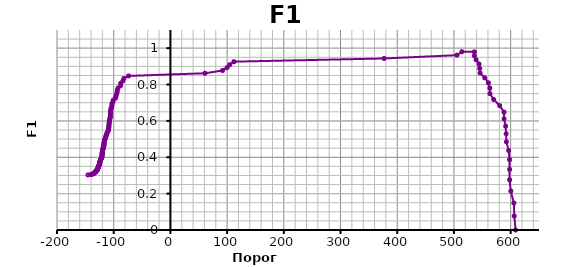
| Category | Series 0 |
|---|---|
| 608.8 | 0 |
| 606.4 | 0.077 |
| 605.6 | 0.148 |
| 600.2 | 0.214 |
| 598.1 | 0.276 |
| 598.1 | 0.333 |
| 598.1 | 0.387 |
| 596.4 | 0.438 |
| 592.5 | 0.485 |
| 592.0 | 0.529 |
| 591.1 | 0.571 |
| 588.5 | 0.611 |
| 588.3 | 0.649 |
| 580.7 | 0.684 |
| 570.1 | 0.718 |
| 563.5 | 0.75 |
| 563.2 | 0.78 |
| 560.9 | 0.81 |
| 554.4 | 0.837 |
| 546.1 | 0.864 |
| 545.4 | 0.889 |
| 544.3 | 0.913 |
| 539.0 | 0.936 |
| 536.2 | 0.958 |
| 536.2 | 0.98 |
| 514.0 | 0.98 |
| 505.4 | 0.962 |
| 376.6 | 0.943 |
| 112.1 | 0.926 |
| 104.6 | 0.909 |
| 99.9 | 0.893 |
| 91.8 | 0.877 |
| 61.1 | 0.862 |
| -73.6 | 0.847 |
| -82.1 | 0.833 |
| -83.8 | 0.82 |
| -87.8 | 0.806 |
| -87.8 | 0.794 |
| -92.3 | 0.781 |
| -93.7 | 0.769 |
| -94.0 | 0.758 |
| -95.1 | 0.746 |
| -96.0 | 0.735 |
| -97.0 | 0.725 |
| -100.7 | 0.714 |
| -101.4 | 0.704 |
| -103.0 | 0.694 |
| -103.1 | 0.685 |
| -103.6 | 0.676 |
| -104.9 | 0.667 |
| -105.3 | 0.658 |
| -105.5 | 0.649 |
| -105.5 | 0.641 |
| -105.9 | 0.633 |
| -106.1 | 0.625 |
| -106.1 | 0.617 |
| -107.2 | 0.61 |
| -107.3 | 0.602 |
| -107.8 | 0.595 |
| -107.8 | 0.588 |
| -108.3 | 0.581 |
| -108.4 | 0.575 |
| -108.6 | 0.568 |
| -108.7 | 0.562 |
| -109.2 | 0.556 |
| -109.2 | 0.549 |
| -110.0 | 0.543 |
| -111.3 | 0.538 |
| -111.7 | 0.532 |
| -112.6 | 0.526 |
| -113.1 | 0.521 |
| -113.6 | 0.515 |
| -114.3 | 0.51 |
| -114.4 | 0.505 |
| -115.4 | 0.5 |
| -116.3 | 0.495 |
| -116.3 | 0.49 |
| -116.8 | 0.485 |
| -116.9 | 0.481 |
| -117.1 | 0.476 |
| -117.1 | 0.472 |
| -117.4 | 0.467 |
| -117.5 | 0.463 |
| -117.7 | 0.459 |
| -118.7 | 0.455 |
| -118.7 | 0.45 |
| -118.8 | 0.446 |
| -119.1 | 0.442 |
| -119.5 | 0.439 |
| -120.0 | 0.435 |
| -120.0 | 0.431 |
| -120.1 | 0.427 |
| -120.3 | 0.424 |
| -120.3 | 0.42 |
| -120.4 | 0.417 |
| -120.4 | 0.413 |
| -120.6 | 0.41 |
| -120.7 | 0.407 |
| -120.9 | 0.403 |
| -120.9 | 0.4 |
| -121.4 | 0.397 |
| -121.4 | 0.394 |
| -122.2 | 0.391 |
| -123.3 | 0.388 |
| -123.4 | 0.385 |
| -123.5 | 0.382 |
| -124.1 | 0.379 |
| -124.2 | 0.376 |
| -124.6 | 0.373 |
| -124.6 | 0.37 |
| -124.6 | 0.368 |
| -124.8 | 0.365 |
| -124.8 | 0.362 |
| -125.4 | 0.36 |
| -125.7 | 0.357 |
| -126.4 | 0.355 |
| -126.4 | 0.352 |
| -126.6 | 0.35 |
| -126.6 | 0.347 |
| -127.0 | 0.345 |
| -127.5 | 0.342 |
| -128.1 | 0.34 |
| -128.1 | 0.338 |
| -128.2 | 0.336 |
| -129.0 | 0.333 |
| -129.1 | 0.331 |
| -129.2 | 0.329 |
| -130.9 | 0.327 |
| -131.1 | 0.325 |
| -131.1 | 0.323 |
| -131.4 | 0.321 |
| -131.7 | 0.318 |
| -133.6 | 0.316 |
| -134.3 | 0.314 |
| -134.6 | 0.312 |
| -135.4 | 0.311 |
| -136.2 | 0.309 |
| -139.5 | 0.307 |
| -139.8 | 0.305 |
| -145.5 | 0.303 |